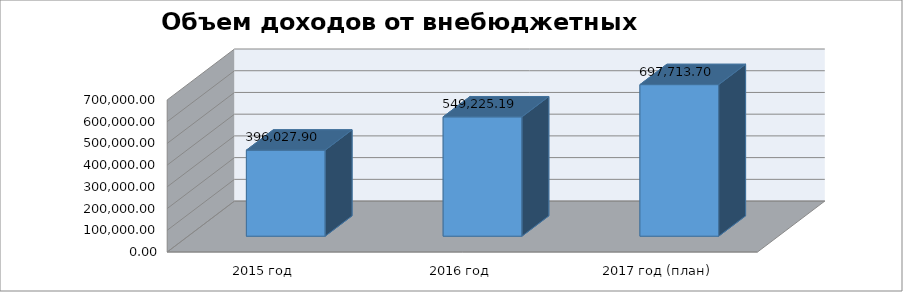
| Category | Series 0 |
|---|---|
| 2015 год | 396027.9 |
| 2016 год | 549225.19 |
| 2017 год (план) | 697713.7 |